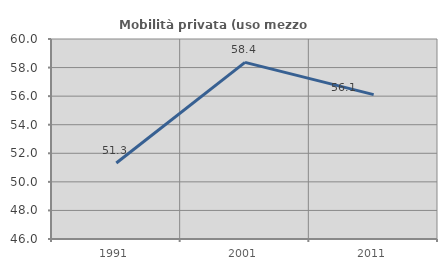
| Category | Mobilità privata (uso mezzo privato) |
|---|---|
| 1991.0 | 51.321 |
| 2001.0 | 58.363 |
| 2011.0 | 56.108 |